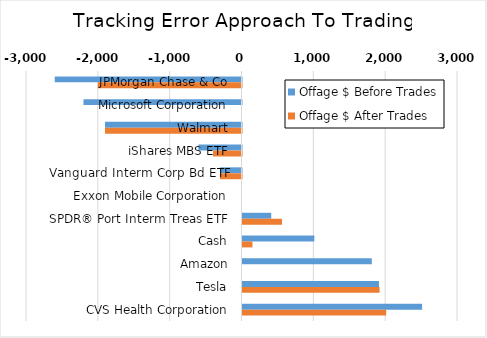
| Category | Offage $ Before Trades | Offage $ After Trades |
|---|---|---|
| JPMorgan Chase & Co | -2600 | -2000 |
| Microsoft Corporation | -2200 | 0 |
| Walmart | -1900 | -1900 |
| iShares MBS ETF | -600 | -396.17 |
| Vanguard Interm Corp Bd ETF | -300 | -300 |
| Exxon Mobile Corporation | 0 | 0 |
| SPDR® Port Interm Treas ETF | 400 | 550.1 |
| Cash | 1000 | 138.33 |
| Amazon | 1800 | 0 |
| Tesla | 1900 | 1907.74 |
| CVS Health Corporation | 2500 | 2000 |